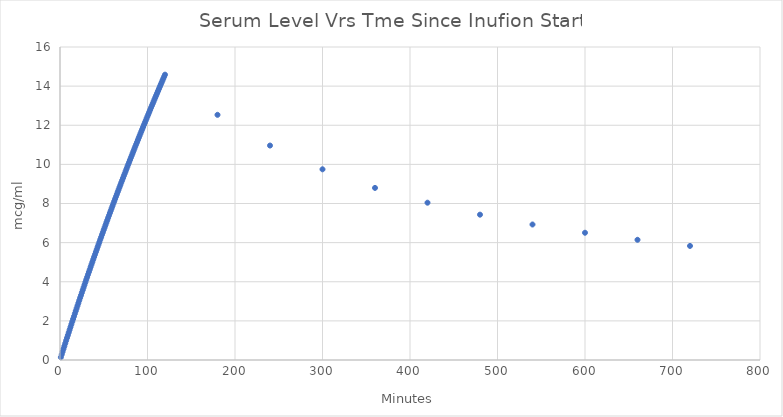
| Category | Series 0 |
|---|---|
| 1.0 | 0.143 |
| 2.0 | 0.285 |
| 3.0 | 0.427 |
| 4.0 | 0.568 |
| 5.0 | 0.709 |
| 6.0 | 0.85 |
| 7.0 | 0.99 |
| 8.0 | 1.13 |
| 9.0 | 1.269 |
| 10.0 | 1.408 |
| 11.0 | 1.547 |
| 12.0 | 1.685 |
| 13.0 | 1.823 |
| 14.0 | 1.96 |
| 15.0 | 2.097 |
| 16.0 | 2.233 |
| 17.0 | 2.37 |
| 18.0 | 2.505 |
| 19.0 | 2.641 |
| 20.0 | 2.776 |
| 21.0 | 2.91 |
| 22.0 | 3.044 |
| 23.0 | 3.178 |
| 24.0 | 3.312 |
| 25.0 | 3.445 |
| 26.0 | 3.577 |
| 27.0 | 3.71 |
| 28.0 | 3.842 |
| 29.0 | 3.973 |
| 30.0 | 4.104 |
| 31.0 | 4.235 |
| 32.0 | 4.366 |
| 33.0 | 4.496 |
| 34.0 | 4.625 |
| 35.0 | 4.755 |
| 36.0 | 4.884 |
| 37.0 | 5.012 |
| 38.0 | 5.141 |
| 39.0 | 5.269 |
| 40.0 | 5.396 |
| 41.0 | 5.523 |
| 42.0 | 5.65 |
| 43.0 | 5.777 |
| 44.0 | 5.903 |
| 45.0 | 6.029 |
| 46.0 | 6.154 |
| 47.0 | 6.279 |
| 48.0 | 6.404 |
| 49.0 | 6.529 |
| 50.0 | 6.653 |
| 51.0 | 6.777 |
| 52.0 | 6.9 |
| 53.0 | 7.023 |
| 54.0 | 7.146 |
| 55.0 | 7.268 |
| 56.0 | 7.39 |
| 57.0 | 7.512 |
| 58.0 | 7.634 |
| 59.0 | 7.755 |
| 60.0 | 7.876 |
| 61.0 | 7.996 |
| 62.0 | 8.116 |
| 63.0 | 8.236 |
| 64.0 | 8.356 |
| 65.0 | 8.475 |
| 66.0 | 8.594 |
| 67.0 | 8.712 |
| 68.0 | 8.831 |
| 69.0 | 8.949 |
| 70.0 | 9.066 |
| 71.0 | 9.184 |
| 72.0 | 9.301 |
| 73.0 | 9.418 |
| 74.0 | 9.534 |
| 75.0 | 9.65 |
| 76.0 | 9.766 |
| 77.0 | 9.882 |
| 78.0 | 9.997 |
| 79.0 | 10.112 |
| 80.0 | 10.226 |
| 81.0 | 10.341 |
| 82.0 | 10.455 |
| 83.0 | 10.569 |
| 84.0 | 10.682 |
| 85.0 | 10.795 |
| 86.0 | 10.908 |
| 87.0 | 11.021 |
| 88.0 | 11.133 |
| 89.0 | 11.245 |
| 90.0 | 11.357 |
| 91.0 | 11.469 |
| 92.0 | 11.58 |
| 93.0 | 11.691 |
| 94.0 | 11.801 |
| 95.0 | 11.912 |
| 96.0 | 12.022 |
| 97.0 | 12.132 |
| 98.0 | 12.241 |
| 99.0 | 12.351 |
| 100.0 | 12.46 |
| 101.0 | 12.569 |
| 102.0 | 12.677 |
| 103.0 | 12.785 |
| 104.0 | 12.893 |
| 105.0 | 13.001 |
| 106.0 | 13.108 |
| 107.0 | 13.216 |
| 108.0 | 13.323 |
| 109.0 | 13.429 |
| 110.0 | 13.536 |
| 111.0 | 13.642 |
| 112.0 | 13.748 |
| 113.0 | 13.853 |
| 114.0 | 13.959 |
| 115.0 | 14.064 |
| 116.0 | 14.169 |
| 117.0 | 14.273 |
| 118.0 | 14.378 |
| 119.0 | 14.482 |
| 120.0 | 14.586 |
| 180.0 | 12.533 |
| 240.0 | 10.963 |
| 300.0 | 9.748 |
| 360.0 | 8.797 |
| 420.0 | 8.041 |
| 480.0 | 7.43 |
| 540.0 | 6.927 |
| 600.0 | 6.505 |
| 660.0 | 6.144 |
| 720.0 | 5.831 |